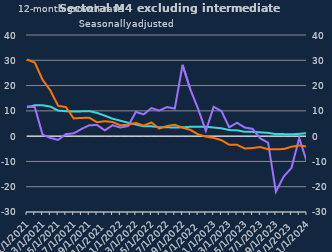
| Category | zero | Households | Non-intermediate OFCs |
|---|---|---|---|
| Jan-2021 | 0 | 11.4 | 11.8 |
| Feb-2021 | 0 | 12.2 | 11.5 |
| Mar-2021 | 0 | 12.2 | 0.6 |
| Apr-2021 | 0 | 11.7 | -0.7 |
| May-2021 | 0 | 10.1 | -1.5 |
| Jun-2021 | 0 | 9.9 | 0.8 |
| Jul-2021 | 0 | 9.7 | 1.1 |
| Aug-2021 | 0 | 9.8 | 2.8 |
| Sep-2021 | 0 | 9.9 | 4.3 |
| Oct-2021 | 0 | 9.2 | 4.4 |
| Nov-2021 | 0 | 8.1 | 2.3 |
| Dec-2021 | 0 | 6.9 | 4.3 |
| Jan-2022 | 0 | 6.1 | 3.4 |
| Feb-2022 | 0 | 5.3 | 4 |
| Mar-2022 | 0 | 4.6 | 9.6 |
| Apr-2022 | 0 | 3.9 | 8.6 |
| May-2022 | 0 | 3.9 | 11.1 |
| Jun-2022 | 0 | 3.5 | 10.1 |
| Jul-2022 | 0 | 3.5 | 11.5 |
| Aug-2022 | 0 | 3.4 | 10.9 |
| Sep-2022 | 0 | 3.5 | 28.2 |
| Oct-2022 | 0 | 3.7 | 18.5 |
| Nov-2022 | 0 | 3.7 | 10.8 |
| Dec-2022 | 0 | 3.7 | 2.1 |
| Jan-2023 | 0 | 3.4 | 11.6 |
| Feb-2023 | 0 | 3.1 | 9.9 |
| Mar-2023 | 0 | 2.4 | 3.5 |
| Apr-2023 | 0 | 2.3 | 5.3 |
| May-2023 | 0 | 1.7 | 3.4 |
| Jun-2023 | 0 | 1.7 | 2.9 |
| Jul-2023 | 0 | 1.5 | -0.9 |
| Aug-2023 | 0 | 1.3 | -2.6 |
| Sep-2023 | 0 | 0.8 | -22 |
| Oct-2023 | 0 | 0.8 | -16 |
| Nov-2023 | 0 | 0.7 | -12.6 |
| Dec-2023 | 0 | 0.9 | -0.8 |
| Jan-2024 | 0 | 1.2 | -10.3 |